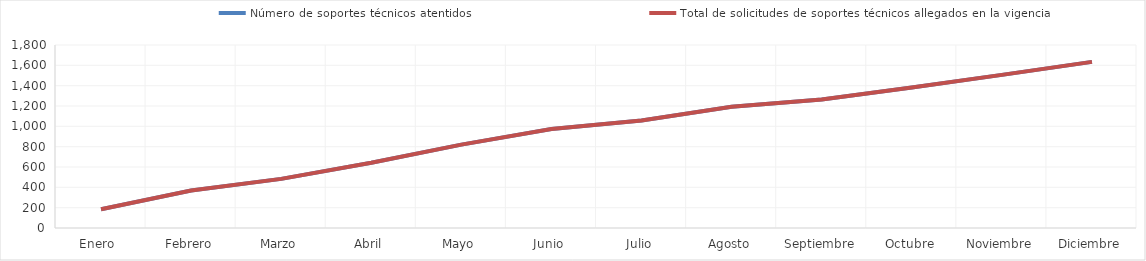
| Category | Número de soportes técnicos atentidos | Total de solicitudes de soportes técnicos allegados en la vigencia |
|---|---|---|
| Enero  | 184 | 184 |
| Febrero | 368 | 368 |
| Marzo | 483 | 483 |
| Abril | 641 | 641 |
| Mayo | 820 | 820 |
| Junio | 974 | 974 |
| Julio | 1057 | 1057 |
| Agosto | 1193 | 1193 |
| Septiembre | 1264 | 1264 |
| Octubre | 1381 | 1381 |
| Noviembre | 1506 | 1506 |
| Diciembre | 1634 | 1634 |